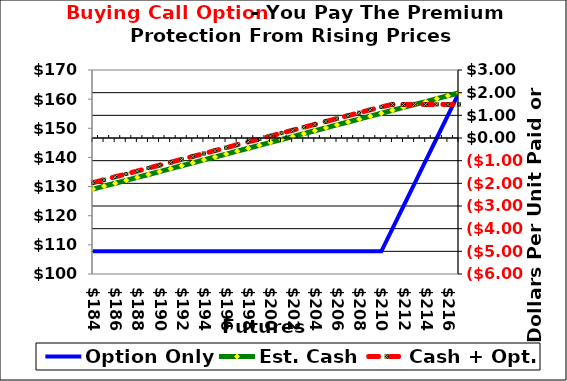
| Category | Option Only |
|---|---|
| 184.0 | -5 |
| 185.0 | -5 |
| 186.0 | -5 |
| 187.0 | -5 |
| 188.0 | -5 |
| 189.0 | -5 |
| 190.0 | -5 |
| 191.0 | -5 |
| 192.0 | -5 |
| 193.0 | -5 |
| 194.0 | -5 |
| 195.0 | -5 |
| 196.0 | -5 |
| 197.0 | -5 |
| 198.0 | -5 |
| 199.0 | -5 |
| 200.0 | -5 |
| 201.0 | -5 |
| 202.0 | -5 |
| 203.0 | -5 |
| 204.0 | -5 |
| 205.0 | -5 |
| 206.0 | -5 |
| 207.0 | -5 |
| 208.0 | -5 |
| 209.0 | -5 |
| 210.0 | -5 |
| 211.0 | -4 |
| 212.0 | -3 |
| 213.0 | -2 |
| 214.0 | -1 |
| 215.0 | 0 |
| 216.0 | 1 |
| 217.0 | 2 |